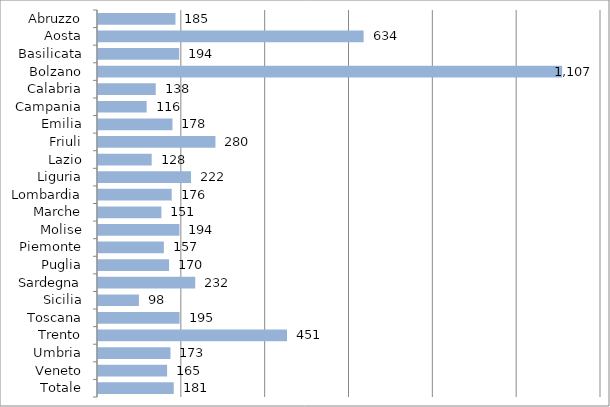
| Category | Series 0 |
|---|---|
| Abruzzo | 184.856 |
| Aosta | 633.688 |
| Basilicata | 193.696 |
| Bolzano | 1107.312 |
| Calabria | 137.77 |
| Campania | 116.11 |
| Emilia | 177.674 |
| Friuli | 280.216 |
| Lazio | 128.119 |
| Liguria | 221.901 |
| Lombardia | 175.873 |
| Marche | 151.241 |
| Molise | 194.277 |
| Piemonte | 157.201 |
| Puglia | 169.608 |
| Sardegna | 231.926 |
| Sicilia | 97.62 |
| Toscana | 194.579 |
| Trento | 450.935 |
| Umbria | 172.908 |
| Veneto | 164.836 |
| Totale | 180.707 |